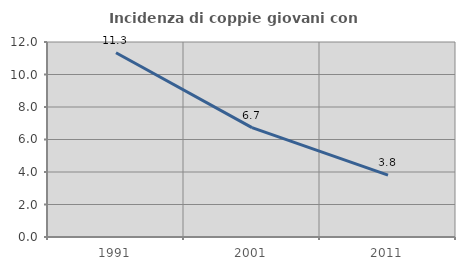
| Category | Incidenza di coppie giovani con figli |
|---|---|
| 1991.0 | 11.34 |
| 2001.0 | 6.731 |
| 2011.0 | 3.81 |